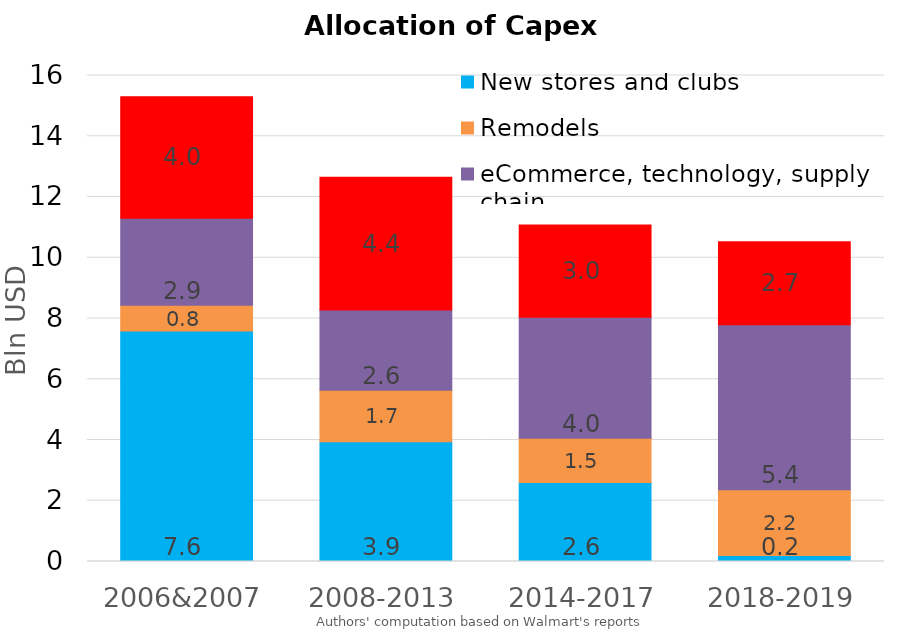
| Category | New stores and clubs | Remodels  | eCommerce, technology, supply chain.. | Walmart International  |
|---|---|---|---|---|
| 2006&2007 | 7.587 | 0.849 | 2.864 | 4.002 |
| 2008-2013 | 3.941 | 1.699 | 2.638 | 4.372 |
| 2014-2017 | 2.602 | 1.452 | 3.984 | 3.042 |
| 2018-2019 | 0.195 | 2.168 | 5.43 | 2.731 |